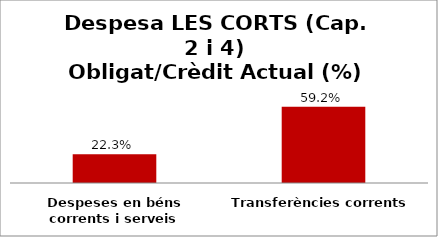
| Category | Series 0 |
|---|---|
| Despeses en béns corrents i serveis | 0.223 |
| Transferències corrents | 0.592 |